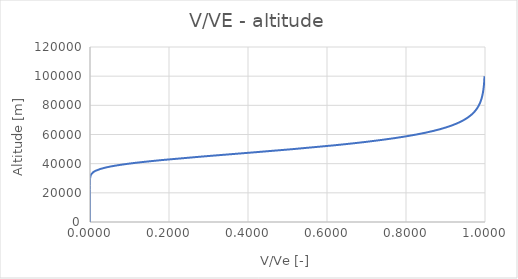
| Category | V/VE |
|---|---|
| 0.9987175917948361 | 100000 |
| 0.9982475682212524 | 97500 |
| 0.9976054799567584 | 95000 |
| 0.9967285173493143 | 92500 |
| 0.9955310984286602 | 90000 |
| 0.9938967473380156 | 87500 |
| 0.991667193403714 | 85000 |
| 0.9886278423066813 | 82500 |
| 0.9844886041130676 | 80000 |
| 0.9788589545523766 | 77500 |
| 0.9712161718918714 | 75000 |
| 0.9608661590038026 | 72500 |
| 0.9468975467340134 | 70000 |
| 0.9281326048664987 | 67500 |
| 0.9030840238922708 | 65000 |
| 0.8699365312504587 | 62500 |
| 0.8265884123952093 | 60000 |
| 0.7708109838067144 | 57500 |
| 0.7006096146930387 | 55000 |
| 0.6148806993492111 | 52500 |
| 0.5144122893811177 | 50000 |
| 0.40309682740804953 | 47500 |
| 0.2888408200922435 | 45000 |
| 0.18315031477241675 | 42500 |
| 0.09826017937284269 | 40000 |
| 0.04195110536710322 | 37500 |
| 0.013107305925869842 | 35000 |
| 0.002672673703299427 | 32500 |
| 0.00030412497548705714 | 30000 |
| 1.5592011818191268e-05 | 27500 |
| 2.6882910050918017e-07 | 25000 |
| 1.0451024952299377e-09 | 22500 |
| 5.304514243128823e-13 | 20000 |
| 1.6656352062963246e-17 | 17500 |
| 1.1657859133784867e-23 | 15000 |
| 4.505930210358249e-32 | 12500 |
| 1.4282468962679515e-43 | 10000 |
| 2.7387950754506272e-59 | 7500 |
| 9.008125938477087e-81 | 5000 |
| 3.89903694267949e-110 | 2500 |
| 2.854758656702688e-150 | 0 |